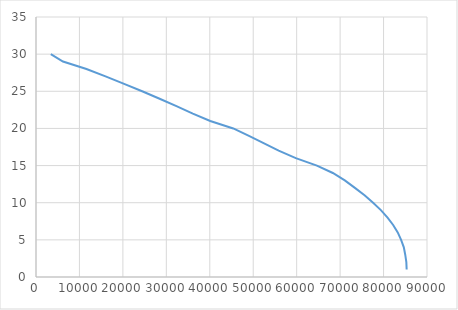
| Category | Series 0 |
|---|---|
| 3404.95 | 30 |
| 6208.47 | 29 |
| 11612.86 | 28 |
| 16004.68 | 27 |
| 20281.93 | 26 |
| 24433.76 | 25 |
| 28455.93 | 24 |
| 32327.66 | 23 |
| 36098.43 | 22 |
| 40108.04 | 21 |
| 45407.93 | 20 |
| 49017.39 | 19 |
| 52499.06 | 18 |
| 55854.5 | 17 |
| 59802.29 | 16 |
| 64660.49 | 15 |
| 68324.46 | 14 |
| 71077.44 | 13 |
| 73405.45 | 12 |
| 75626.07 | 11 |
| 77591.3 | 10 |
| 79382.33 | 9 |
| 80917.54 | 8 |
| 82208.89 | 7 |
| 83263.38 | 6 |
| 84039.87 | 5 |
| 84665.78 | 4 |
| 84989.36 | 3 |
| 85242.57 | 2 |
| 85317.87 | 1 |